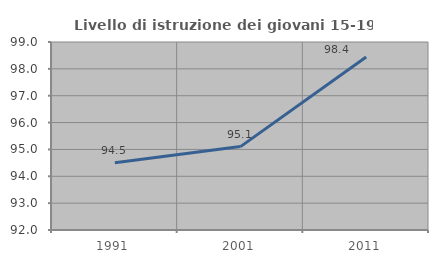
| Category | Livello di istruzione dei giovani 15-19 anni |
|---|---|
| 1991.0 | 94.5 |
| 2001.0 | 95.105 |
| 2011.0 | 98.442 |